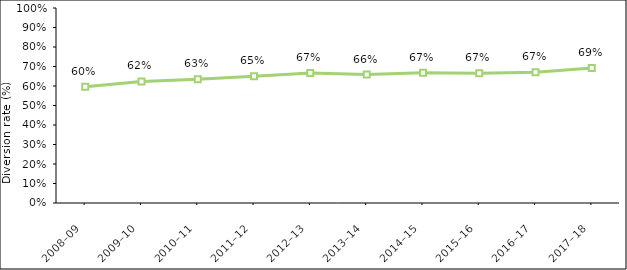
| Category | Diversion rate (%) |
|---|---|
| 2008–09 | 0.596 |
| 2009–10 | 0.624 |
| 2010–11 | 0.635 |
| 2011–12 | 0.65 |
| 2012–13 | 0.666 |
| 2013–14 | 0.658 |
| 2014–15 | 0.667 |
| 2015–16 | 0.665 |
| 2016–17 | 0.67 |
| 2017–18 | 0.692 |